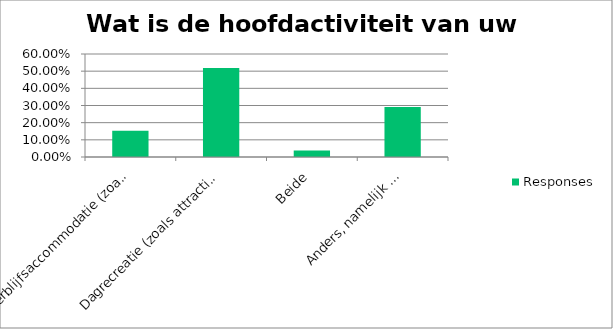
| Category | Responses |
|---|---|
| Verblijfsaccommodatie (zoals hotel, kampeerterrein, huisjesterrein, b&b etc.) | 0.153 |
| Dagrecreatie (zoals attracties, musea, restaurant, evenement, retail etc) | 0.519 |
| Beide | 0.037 |
| Anders, namelijk ... | 0.291 |